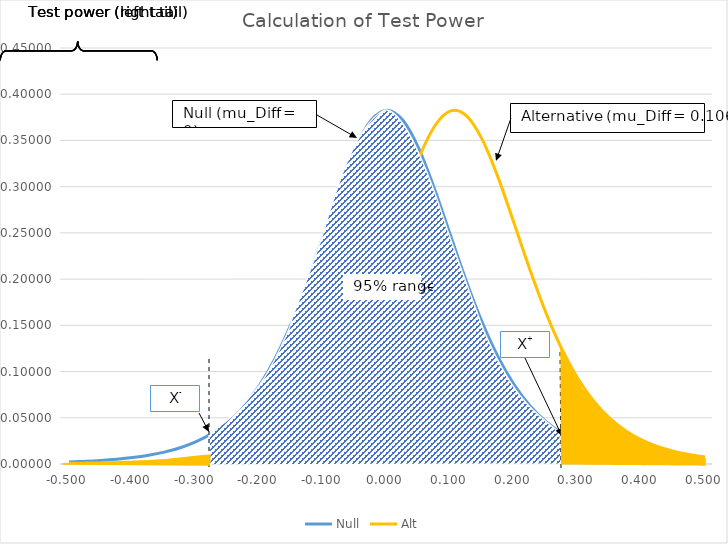
| Category | Null | Alt |
|---|---|---|
| -0.5 | 0.002 | 0.001 |
| -0.475 | 0.003 | 0.001 |
| -0.44999999999999996 | 0.004 | 0.001 |
| -0.42499999999999993 | 0.005 | 0.002 |
| -0.3999999999999999 | 0.007 | 0.002 |
| -0.3749999999999999 | 0.009 | 0.003 |
| -0.34999999999999987 | 0.013 | 0.004 |
| -0.32499999999999984 | 0.018 | 0.005 |
| -0.2999999999999998 | 0.024 | 0.006 |
| -0.2749999999999998 | 0.033 | 0.009 |
| -0.2499999999999998 | 0.046 | 0.012 |
| -0.2249999999999998 | 0.063 | 0.016 |
| -0.19999999999999982 | 0.086 | 0.022 |
| -0.17499999999999982 | 0.115 | 0.031 |
| -0.14999999999999983 | 0.153 | 0.042 |
| -0.12499999999999983 | 0.197 | 0.058 |
| -0.09999999999999984 | 0.247 | 0.079 |
| -0.07499999999999984 | 0.297 | 0.107 |
| -0.04999999999999984 | 0.341 | 0.142 |
| -0.024999999999999842 | 0.372 | 0.185 |
| 1.5959455978986625e-16 | 0.383 | 0.234 |
| 0.02500000000000016 | 0.372 | 0.284 |
| 0.05000000000000016 | 0.341 | 0.331 |
| 0.07500000000000016 | 0.297 | 0.366 |
| 0.10000000000000017 | 0.247 | 0.382 |
| 0.12500000000000017 | 0.197 | 0.377 |
| 0.15000000000000016 | 0.153 | 0.351 |
| 0.17500000000000016 | 0.115 | 0.309 |
| 0.20000000000000015 | 0.086 | 0.26 |
| 0.22500000000000014 | 0.063 | 0.21 |
| 0.25000000000000017 | 0.046 | 0.163 |
| 0.2750000000000002 | 0.033 | 0.124 |
| 0.3000000000000002 | 0.024 | 0.092 |
| 0.32500000000000023 | 0.018 | 0.068 |
| 0.35000000000000026 | 0.013 | 0.05 |
| 0.3750000000000003 | 0.009 | 0.036 |
| 0.4000000000000003 | 0.007 | 0.026 |
| 0.4250000000000003 | 0.005 | 0.019 |
| 0.45000000000000034 | 0.004 | 0.014 |
| 0.47500000000000037 | 0.003 | 0.01 |
| 0.5000000000000003 | 0.002 | 0.008 |